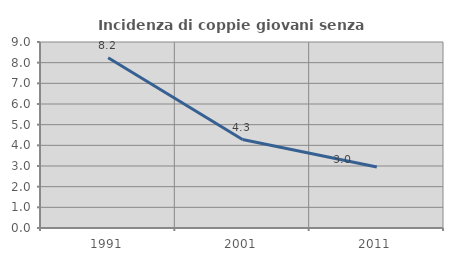
| Category | Incidenza di coppie giovani senza figli |
|---|---|
| 1991.0 | 8.235 |
| 2001.0 | 4.28 |
| 2011.0 | 2.952 |